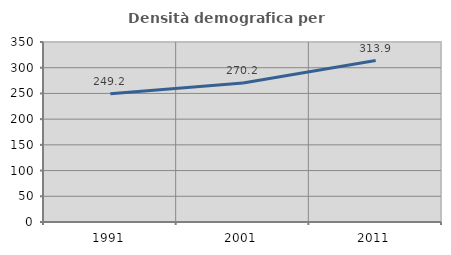
| Category | Densità demografica |
|---|---|
| 1991.0 | 249.249 |
| 2001.0 | 270.201 |
| 2011.0 | 313.884 |